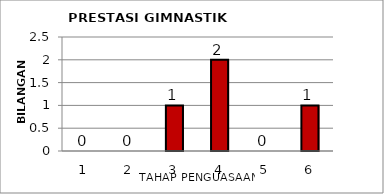
| Category | Series 0 |
|---|---|
| 1.0 | 0 |
| 2.0 | 0 |
| 3.0 | 1 |
| 4.0 | 2 |
| 5.0 | 0 |
| 6.0 | 1 |